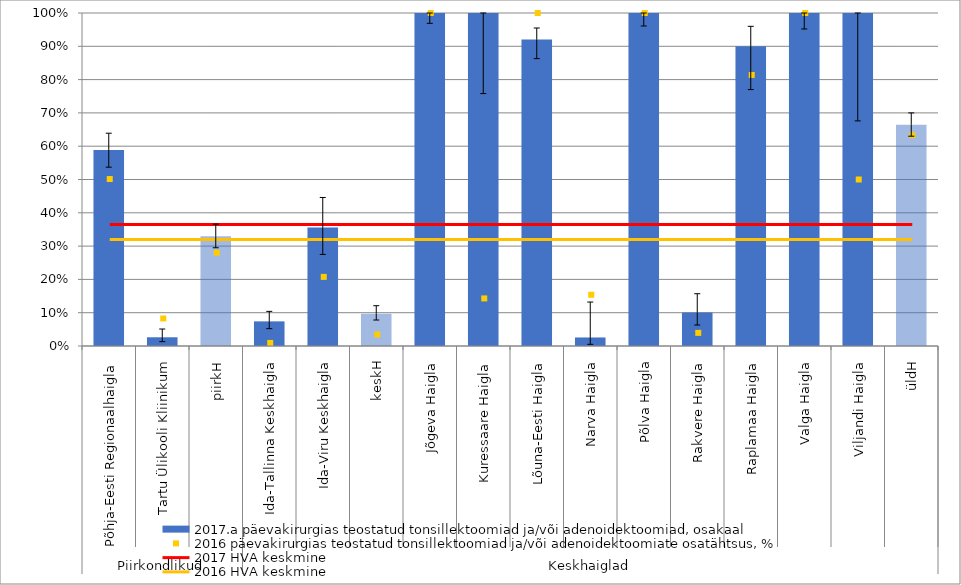
| Category | 2017.a päevakirurgias teostatud tonsillektoomiad ja/või adenoidektoomiad, osakaal |
|---|---|
| 0 | 0.589 |
| 1 | 0.026 |
| 2 | 0.329 |
| 3 | 0.074 |
| 4 | 0.356 |
| 5 | 0.097 |
| 6 | 1 |
| 7 | 1 |
| 8 | 0.92 |
| 9 | 0.026 |
| 10 | 1 |
| 11 | 0.101 |
| 12 | 0.9 |
| 13 | 1 |
| 14 | 1 |
| 15 | 0.664 |